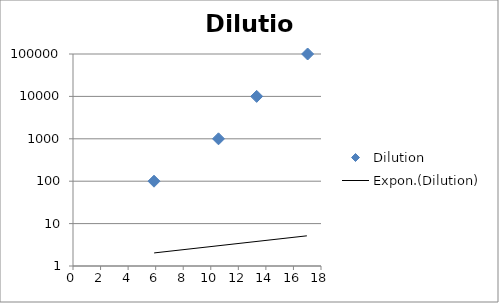
| Category | Dilution |
|---|---|
| 5.88 | 100 |
| 10.56 | 1000 |
| 13.33 | 10000 |
| 17.03 | 100000 |